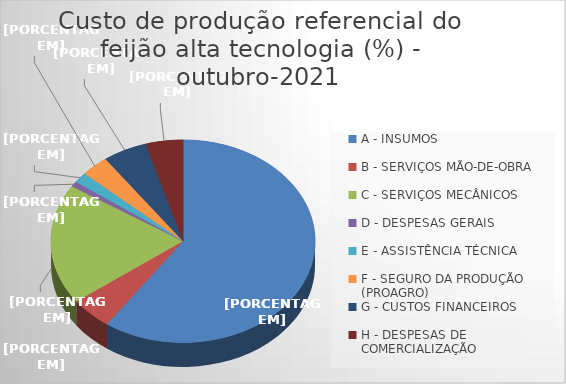
| Category | Series 0 |
|---|---|
| A - INSUMOS | 59.728 |
| B - SERVIÇOS MÃO-DE-OBRA | 5.142 |
| C - SERVIÇOS MECÂNICOS | 19.226 |
| D - DESPESAS GERAIS  | 0.841 |
| E - ASSISTÊNCIA TÉCNICA | 1.699 |
| F - SEGURO DA PRODUÇÃO (PROAGRO) | 3.397 |
| G - CUSTOS FINANCEIROS | 5.402 |
| H - DESPESAS DE COMERCIALIZAÇÃO | 4.565 |